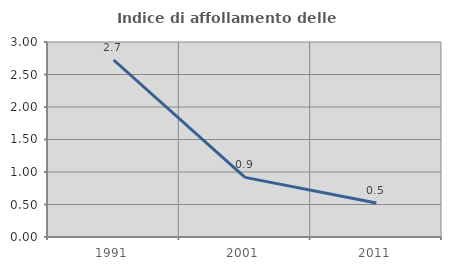
| Category | Indice di affollamento delle abitazioni  |
|---|---|
| 1991.0 | 2.723 |
| 2001.0 | 0.917 |
| 2011.0 | 0.524 |